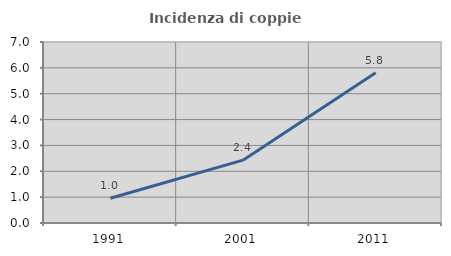
| Category | Incidenza di coppie miste |
|---|---|
| 1991.0 | 0.955 |
| 2001.0 | 2.431 |
| 2011.0 | 5.806 |